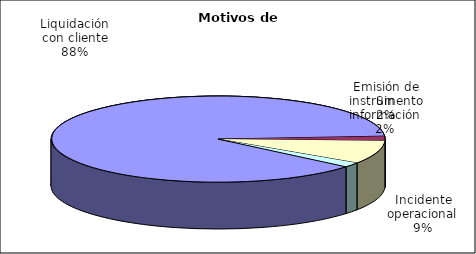
| Category | Motivos |
|---|---|
| Liquidación con cliente | 453 |
| Emisión de instrumento | 9 |
| Incidente operacional | 45 |
| Sin información | 9 |